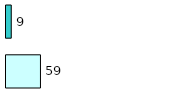
| Category | Series 0 | Series 1 |
|---|---|---|
| 0 | 59 | 9 |